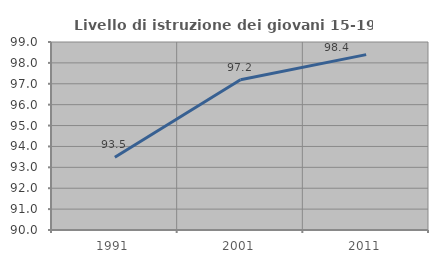
| Category | Livello di istruzione dei giovani 15-19 anni |
|---|---|
| 1991.0 | 93.478 |
| 2001.0 | 97.196 |
| 2011.0 | 98.394 |